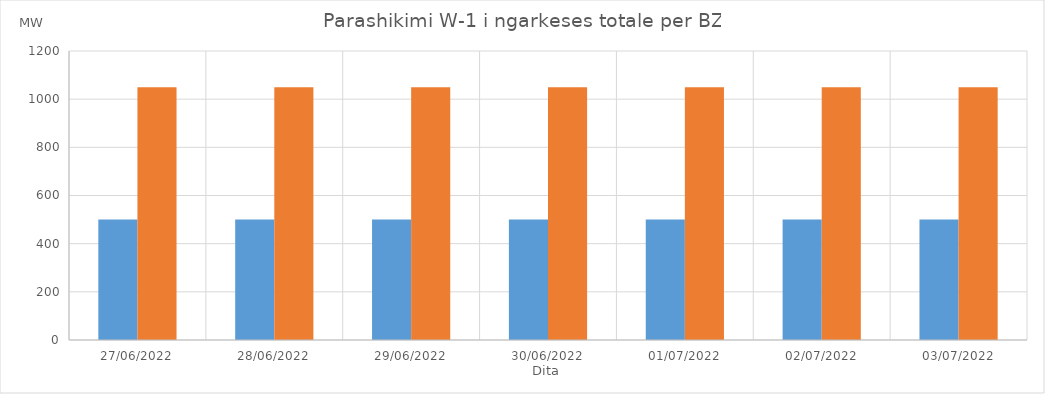
| Category | Min (MW) | Max (MW) |
|---|---|---|
| 27/06/2022 | 500 | 1050 |
| 28/06/2022 | 500 | 1050 |
| 29/06/2022 | 500 | 1050 |
| 30/06/2022 | 500 | 1050 |
| 01/07/2022 | 500 | 1050 |
| 02/07/2022 | 500 | 1050 |
| 03/07/2022 | 500 | 1050 |